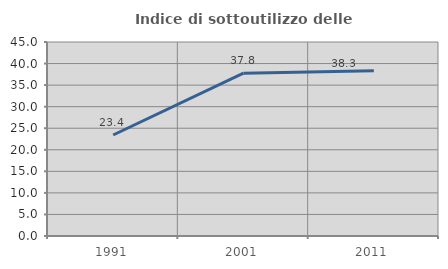
| Category | Indice di sottoutilizzo delle abitazioni  |
|---|---|
| 1991.0 | 23.43 |
| 2001.0 | 37.779 |
| 2011.0 | 38.35 |